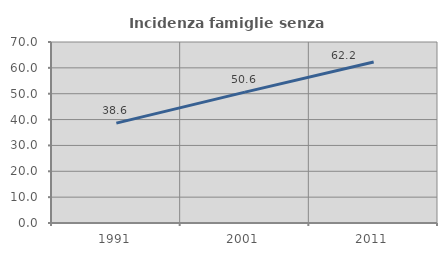
| Category | Incidenza famiglie senza nuclei |
|---|---|
| 1991.0 | 38.628 |
| 2001.0 | 50.602 |
| 2011.0 | 62.245 |